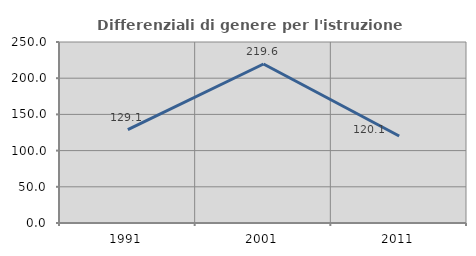
| Category | Differenziali di genere per l'istruzione superiore |
|---|---|
| 1991.0 | 129.07 |
| 2001.0 | 219.595 |
| 2011.0 | 120.115 |